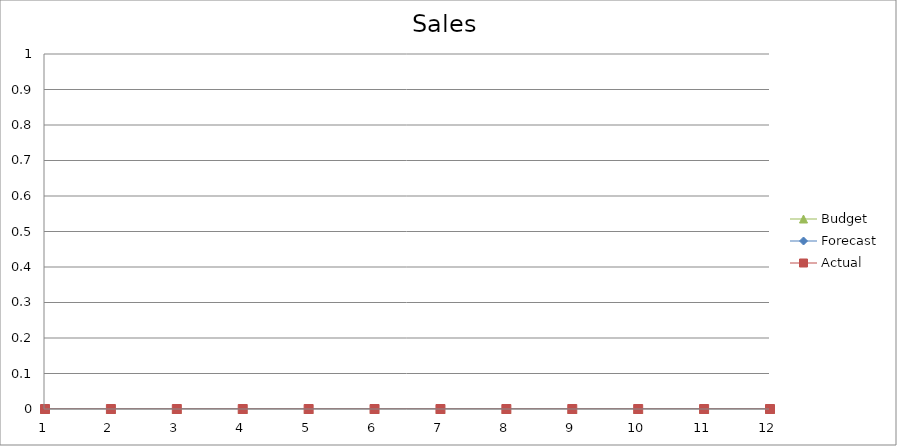
| Category | Budget | Forecast | Actual |
|---|---|---|---|
| 0 | 1550 | 1200 | 1520 |
| 1 | 3450 | 3310 | 3400 |
| 2 | 2430 | 3090 | 1190 |
| 3 | 1210 | 1980 | 2310 |
| 4 | 1830 | 570 | 2440 |
| 5 | 2880 | 3350 | 2440 |
| 6 | 1350 | 3320 | 670 |
| 7 | 1140 | 1190 | 3330 |
| 8 | 2540 | 800 | 2570 |
| 9 | 3220 | 980 | 530 |
| 10 | 2890 | 2740 | 870 |
| 11 | 1800 | 2320 | 1850 |